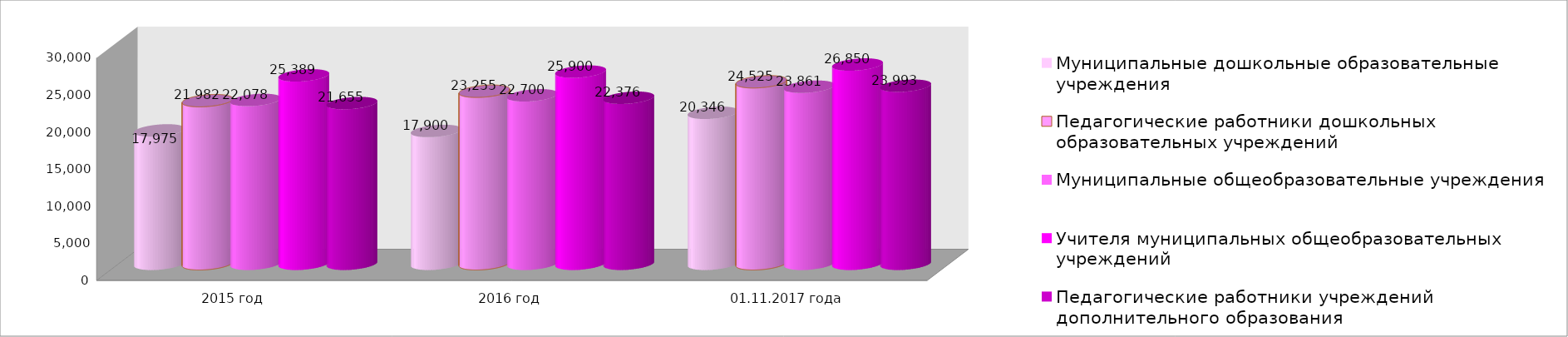
| Category | Муниципальные дошкольные образовательные учреждения | Педагогические работники дошкольных образовательных учреждений | Муниципальные общеобразовательные учреждения | Учителя муниципальных общеобразовательных учреждений | Педагогические работники учреждений дополнительного образования |
|---|---|---|---|---|---|
| 2015 год | 17975 | 21982 | 22078 | 25389 | 21655 |
| 2016 год | 17900 | 23255 | 22700 | 25900 | 22376 |
| 01.11.2017 года | 20346 | 24525 | 23861 | 26850 | 23993 |